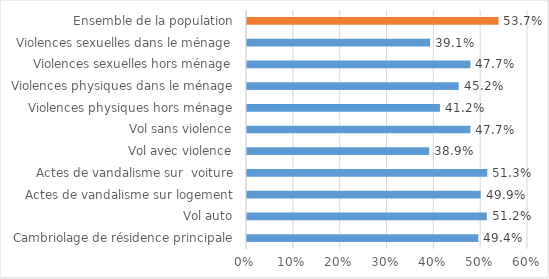
| Category | Series 0 |
|---|---|
| Cambriolage de résidence principale | 0.494 |
| Vol auto | 0.512 |
| Actes de vandalisme sur logement | 0.499 |
| Actes de vandalisme sur  voiture | 0.513 |
| Vol avec violence | 0.389 |
| Vol sans violence | 0.477 |
| Violences physiques hors ménage | 0.412 |
| Violences physiques dans le ménage | 0.452 |
| Violences sexuelles hors ménage | 0.477 |
| Violences sexuelles dans le ménage | 0.391 |
| Ensemble de la population | 0.537 |